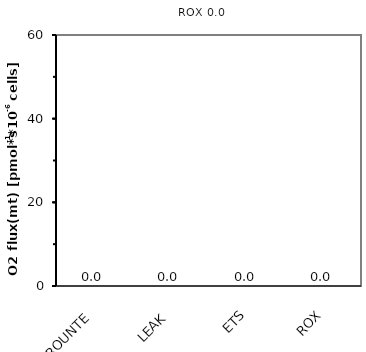
| Category | ROX 0,0 |
|---|---|
| ROUNTE | 0 |
| LEAK | 0 |
| ETS | 0 |
| ROX | 0 |